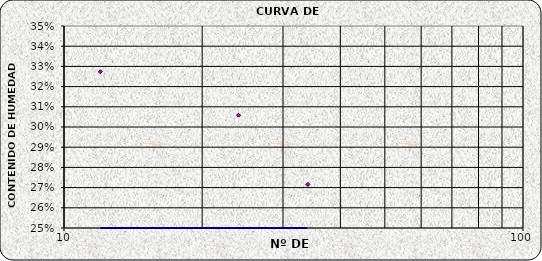
| Category | Series 0 |
|---|---|
| 34.0 | 0.272 |
| 24.0 | 0.306 |
| 12.0 | 0.327 |